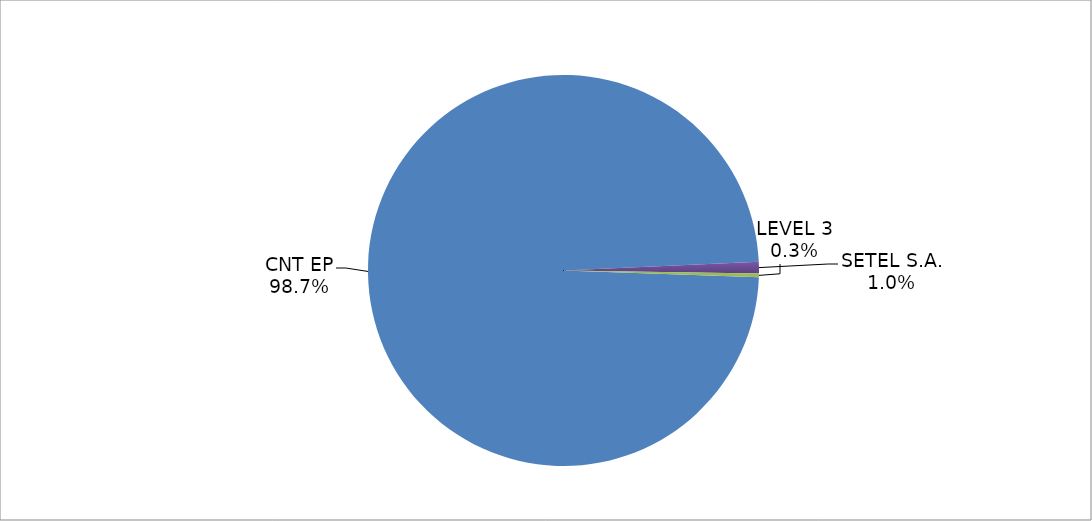
| Category | Series 0 |
|---|---|
| CNT EP | 312 |
| SETEL S.A. | 3 |
| LEVEL 3 | 1 |